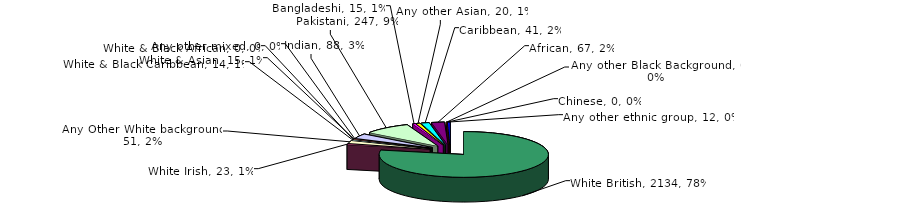
| Category | Series 0 |
|---|---|
| White British | 2134 |
| White Irish | 23 |
| Any Other White background | 51 |
| White & Black Caribbean | 14 |
| White & Black African | 0 |
| White & Asian | 15 |
| Any other mixed | 0 |
| Indian | 88 |
| Pakistani | 247 |
| Bangladeshi | 15 |
| Any other Asian | 20 |
| Caribbean | 41 |
| African | 67 |
| Any other Black Background | 6 |
| Chinese | 0 |
| Any other ethnic group | 12 |